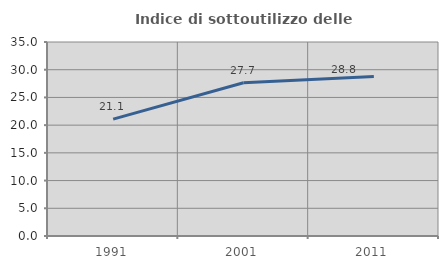
| Category | Indice di sottoutilizzo delle abitazioni  |
|---|---|
| 1991.0 | 21.088 |
| 2001.0 | 27.652 |
| 2011.0 | 28.766 |